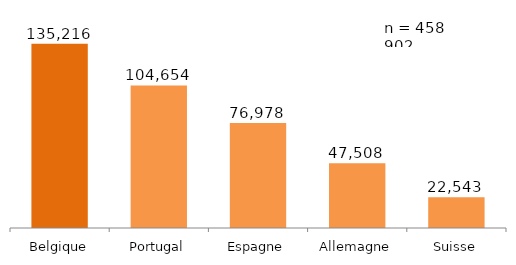
| Category | Series 0 |
|---|---|
| Belgique | 135216 |
| Portugal | 104654 |
| Espagne | 76978 |
| Allemagne | 47508 |
| Suisse | 22543 |